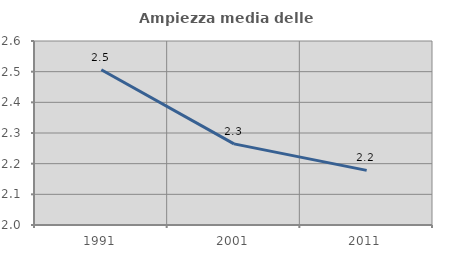
| Category | Ampiezza media delle famiglie |
|---|---|
| 1991.0 | 2.506 |
| 2001.0 | 2.265 |
| 2011.0 | 2.178 |